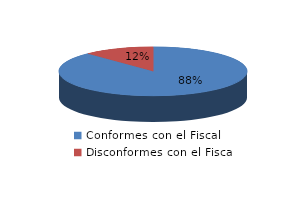
| Category | Series 0 |
|---|---|
| 0 | 123 |
| 1 | 17 |